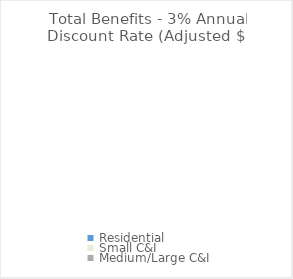
| Category | Total Benefit - 3% Annual Discount Rate (Adjusted $) |
|---|---|
| Residential | 0 |
| Small C&I | 0 |
| Medium/Large C&I | 0 |